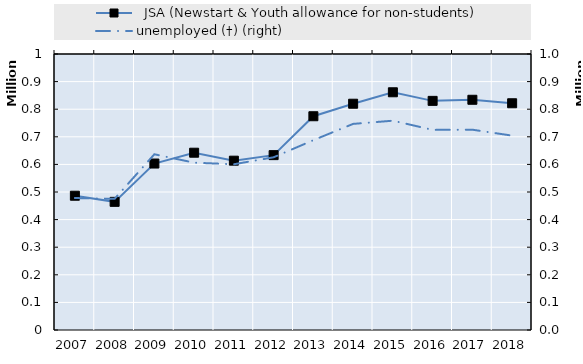
| Category | Series 1 | 0 | Series 14 | Series 15 | Series 16 | Series 17 | Series 18 | Series 19 |
|---|---|---|---|---|---|---|---|---|
| 2007.0 | 486491 |  |  |  |  |  |  |  |
| 2008.0 | 464308 |  |  |  |  |  |  |  |
| 2009.0 | 603101 |  |  |  |  |  |  |  |
| 2010.0 | 642352 |  |  |  |  |  |  |  |
| 2011.0 | 613452 |  |  |  |  |  |  |  |
| 2012.0 | 633575 |  |  |  |  |  |  |  |
| 2013.0 | 774513 |  |  |  |  |  |  |  |
| 2014.0 | 819812 |  |  |  |  |  |  |  |
| 2015.0 | 861339 |  |  |  |  |  |  |  |
| 2016.0 | 830200 |  |  |  |  |  |  |  |
| 2017.0 | 834133 |  |  |  |  |  |  |  |
| 2018.0 | 821542 |  |  |  |  |  |  |  |